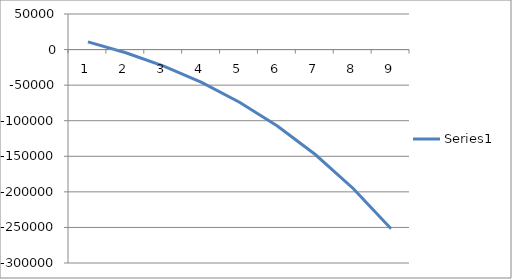
| Category | Series 0 |
|---|---|
| 0 | 10752.711 |
| 1 | -4478.639 |
| 2 | -23258.117 |
| 3 | -46195.135 |
| 4 | -73992.364 |
| 5 | -107459.191 |
| 6 | -147527.059 |
| 7 | -195266.932 |
| 8 | -251909.19 |